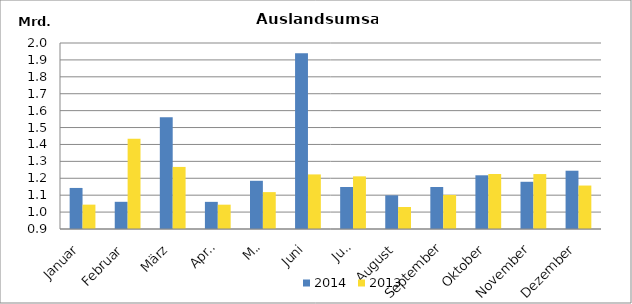
| Category | 2014 | 2013 |
|---|---|---|
| Januar | 1142812.742 | 1044091.324 |
| Februar | 1060814.985 | 1433061.197 |
| März | 1560784.616 | 1267099.165 |
| April | 1060513.123 | 1043827.713 |
| Mai | 1185139.422 | 1118148.121 |
| Juni | 1938953.333 | 1222795.621 |
| Juli | 1148437.569 | 1211388.505 |
| August | 1099188.451 | 1030141.41 |
| September | 1148268.897 | 1101427.152 |
| Oktober | 1217606.446 | 1225398.352 |
| November | 1179234.983 | 1224957.438 |
| Dezember | 1244697.703 | 1157019.441 |